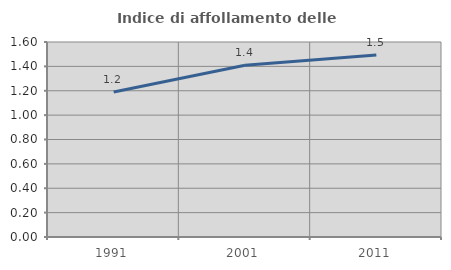
| Category | Indice di affollamento delle abitazioni  |
|---|---|
| 1991.0 | 1.19 |
| 2001.0 | 1.408 |
| 2011.0 | 1.493 |